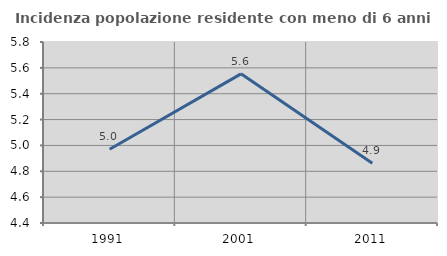
| Category | Incidenza popolazione residente con meno di 6 anni |
|---|---|
| 1991.0 | 4.97 |
| 2001.0 | 5.554 |
| 2011.0 | 4.862 |